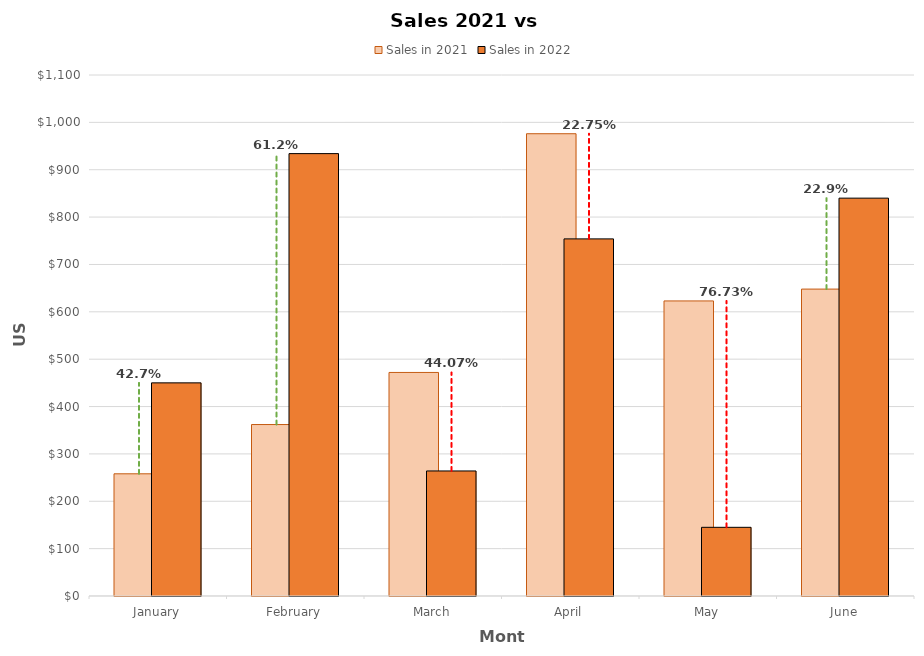
| Category | Sales in 2021 | Sales in 2022 |
|---|---|---|
| January | 258 | 450 |
| February | 362 | 934 |
| March | 472 | 264 |
| April | 976 | 754 |
| May | 623 | 145 |
| June | 648 | 840 |